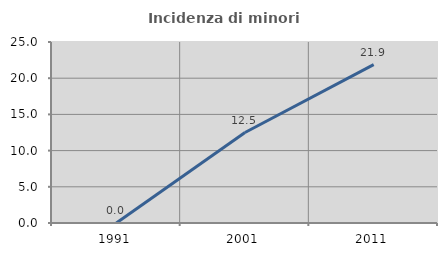
| Category | Incidenza di minori stranieri |
|---|---|
| 1991.0 | 0 |
| 2001.0 | 12.5 |
| 2011.0 | 21.875 |